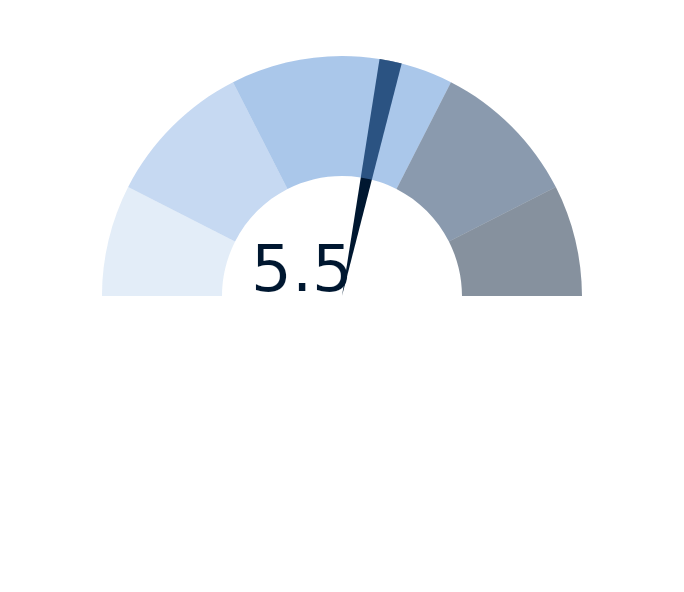
| Category | Series 2 |
|---|---|
| 0 | 5.5 |
| 1 | 0.3 |
| 2 | 14.2 |